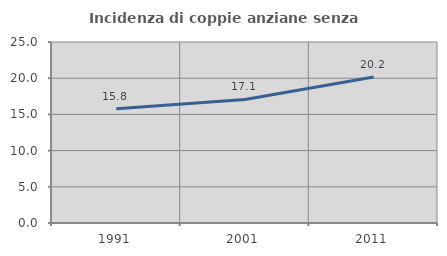
| Category | Incidenza di coppie anziane senza figli  |
|---|---|
| 1991.0 | 15.787 |
| 2001.0 | 17.06 |
| 2011.0 | 20.163 |